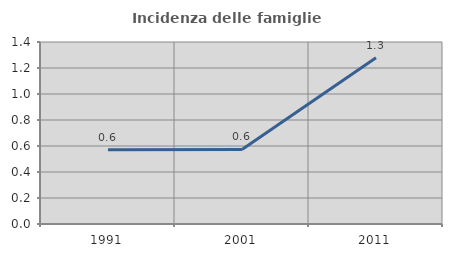
| Category | Incidenza delle famiglie numerose |
|---|---|
| 1991.0 | 0.572 |
| 2001.0 | 0.573 |
| 2011.0 | 1.279 |